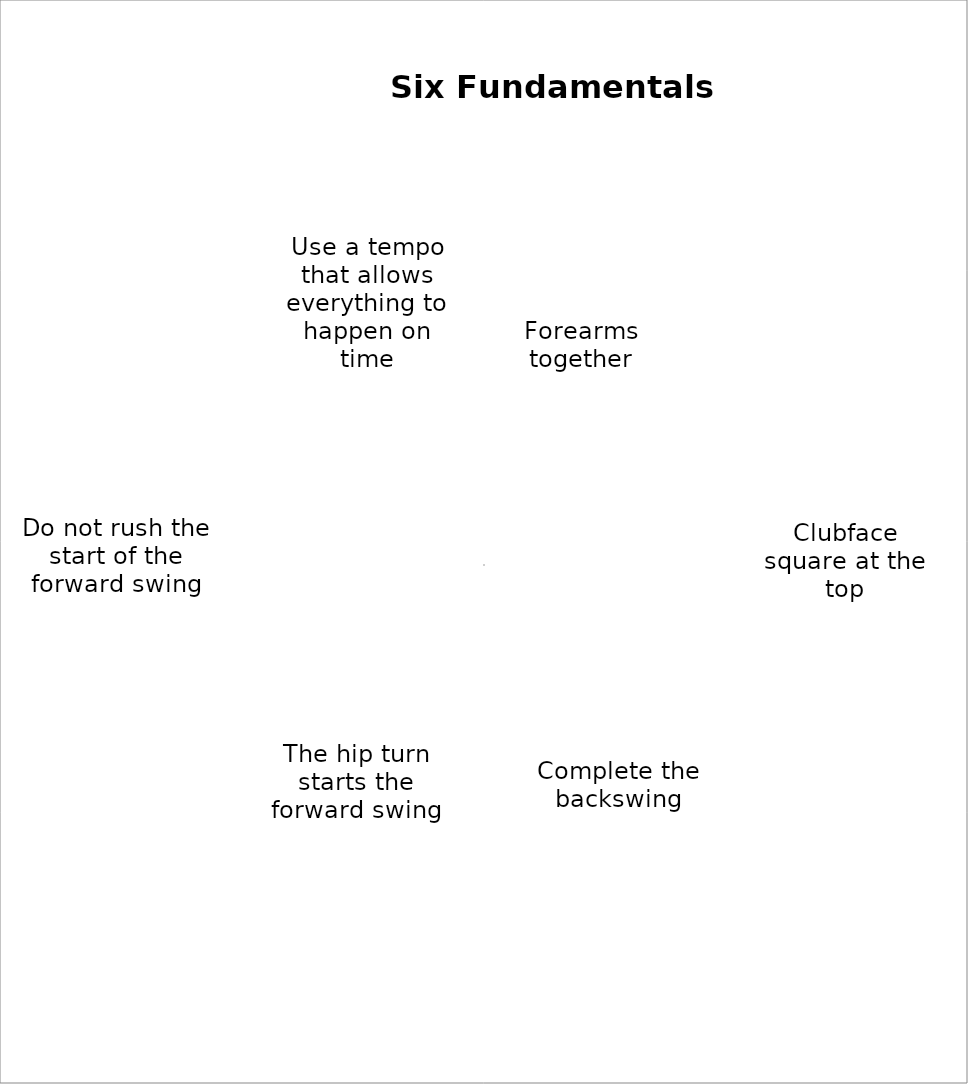
| Category | Series 0 |
|---|---|
| Forearms together | 16.666 |
| Clubface square at the top | 16.666 |
| Complete the backswing | 16.666 |
| The hip turn starts the forward swing | 16.666 |
| Do not rush the start of the forward swing | 16.666 |
| Use a tempo that allows everything to happen on time | 16.666 |